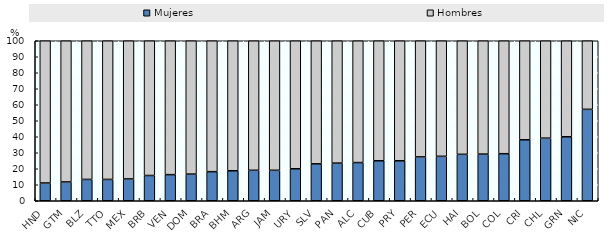
| Category | Mujeres | Hombres |
|---|---|---|
| HND | 11.111 | 88.889 |
| GTM | 11.765 | 88.235 |
| BLZ | 13.333 | 86.667 |
| TTO | 13.333 | 86.667 |
| MEX | 13.636 | 86.364 |
| BRB | 15.789 | 84.211 |
| VEN | 16.327 | 83.673 |
| DOM | 16.667 | 83.333 |
| BRA | 18.182 | 81.818 |
| BHM | 18.75 | 81.25 |
| ARG | 19.048 | 80.952 |
| JAM | 19.048 | 80.952 |
| URY | 20 | 80 |
| SLV | 23.077 | 76.923 |
| PAN | 23.529 | 76.471 |
| ALC | 23.876 | 76.124 |
| CUB | 25 | 75 |
| PRY | 25 | 75 |
| PER | 27.419 | 72.581 |
| ECU | 27.778 | 72.222 |
| HAI | 29.032 | 70.968 |
| BOL | 29.167 | 70.833 |
| COL | 29.412 | 70.588 |
| CRI | 38.095 | 61.905 |
| CHL | 39.13 | 60.87 |
| GRN | 40 | 60 |
| NIC | 57.143 | 42.857 |